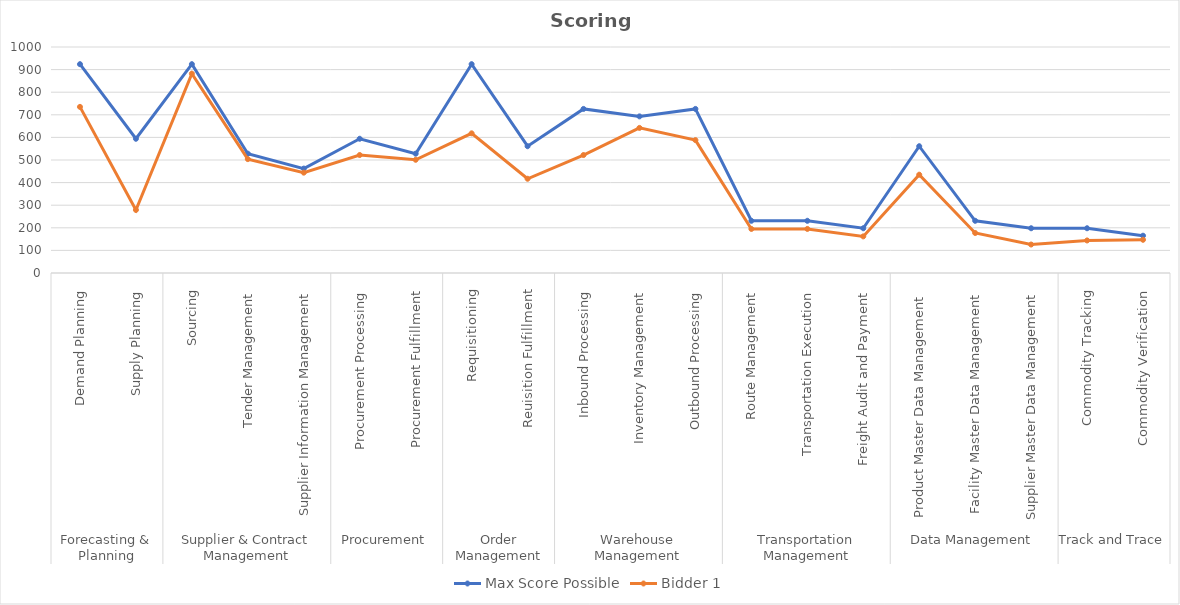
| Category | Max Score Possible | Bidder 1 |
|---|---|---|
| 0 | 924 | 735 |
| 1 | 594 | 279 |
| 2 | 924 | 882 |
| 3 | 528 | 504 |
| 4 | 462 | 444 |
| 5 | 594 | 522 |
| 6 | 528 | 501 |
| 7 | 924 | 618 |
| 8 | 561 | 417 |
| 9 | 726 | 522 |
| 10 | 693 | 642 |
| 11 | 726 | 588 |
| 12 | 231 | 195 |
| 13 | 231 | 195 |
| 14 | 198 | 162 |
| 15 | 561 | 435 |
| 16 | 231 | 177 |
| 17 | 198 | 126 |
| 18 | 198 | 144 |
| 19 | 165 | 147 |